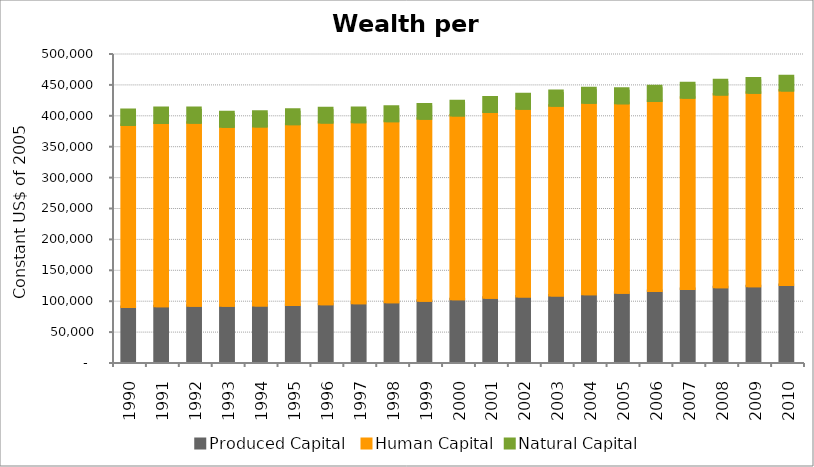
| Category | Produced Capital  | Human Capital | Natural Capital |
|---|---|---|---|
| 1990.0 | 88827.299 | 294778.654 | 24348.547 |
| 1991.0 | 90301.514 | 296552.547 | 24138.042 |
| 1992.0 | 91001.345 | 296268.79 | 23933.058 |
| 1993.0 | 91015.946 | 289508.991 | 23744.446 |
| 1994.0 | 91393.032 | 289803.521 | 23578.575 |
| 1995.0 | 92327.107 | 292501.49 | 23421.947 |
| 1996.0 | 93609.645 | 293756.844 | 23349.693 |
| 1997.0 | 95004.679 | 292853.722 | 23291.643 |
| 1998.0 | 96881.687 | 292751.363 | 23257.716 |
| 1999.0 | 99168.111 | 294468.768 | 23218.462 |
| 2000.0 | 101629.414 | 297305.396 | 23156.946 |
| 2001.0 | 103904.19 | 300666.836 | 23310.851 |
| 2002.0 | 105892.372 | 303939.151 | 23448.23 |
| 2003.0 | 107779.421 | 307005.08 | 23553.763 |
| 2004.0 | 109819.512 | 309618.039 | 23643.679 |
| 2005.0 | 112178.528 | 306340.673 | 23712.852 |
| 2006.0 | 114936.605 | 307578.755 | 23606.191 |
| 2007.0 | 118099.653 | 309598.705 | 23485.301 |
| 2008.0 | 121112.779 | 311585.505 | 23348.547 |
| 2009.0 | 122532.117 | 313053.77 | 23228.368 |
| 2010.0 | 124416.834 | 314917.12 | 23128.155 |